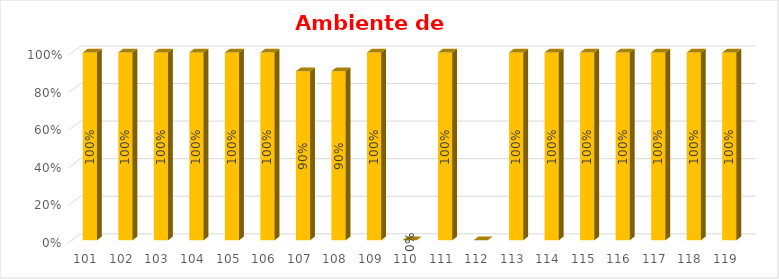
| Category | % Avance |
|---|---|
| 101.0 | 1 |
| 102.0 | 1 |
| 103.0 | 1 |
| 104.0 | 1 |
| 105.0 | 1 |
| 106.0 | 1 |
| 107.0 | 0.9 |
| 108.0 | 0.9 |
| 109.0 | 1 |
| 110.0 | 0 |
| 111.0 | 1 |
| 112.0 | 0 |
| 113.0 | 1 |
| 114.0 | 1 |
| 115.0 | 1 |
| 116.0 | 1 |
| 117.0 | 1 |
| 118.0 | 1 |
| 119.0 | 1 |